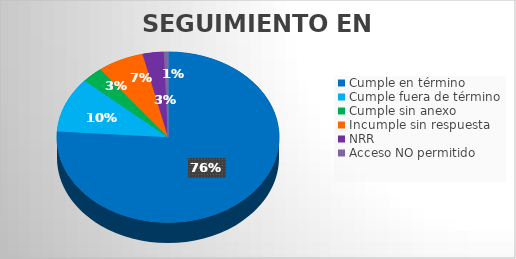
| Category | Series 0 |
|---|---|
| SEGUIMIENTO EN TÉRMINO | 0 |
| Cumple en término | 124 |
| Cumple fuera de término | 17 |
| Cumple sin anexo | 5 |
| Incumple sin respuesta | 11 |
| NRR | 5 |
| Acceso NO permitido | 1 |